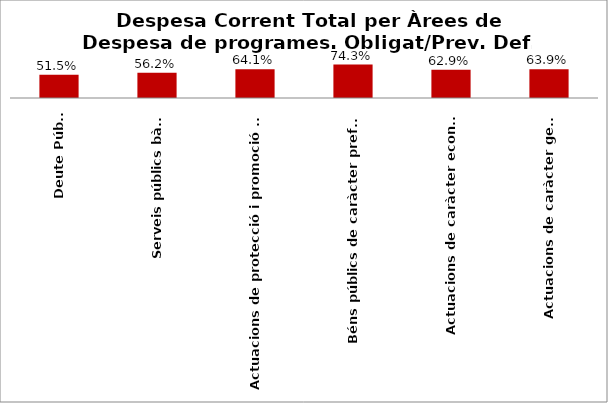
| Category | Series 0 |
|---|---|
| Deute Públic | 0.515 |
| Serveis públics bàsics | 0.562 |
| Actuacions de protecció i promoció social | 0.641 |
| Béns públics de caràcter preferent | 0.743 |
| Actuacions de caràcter econòmic | 0.629 |
| Actuacions de caràcter general | 0.639 |